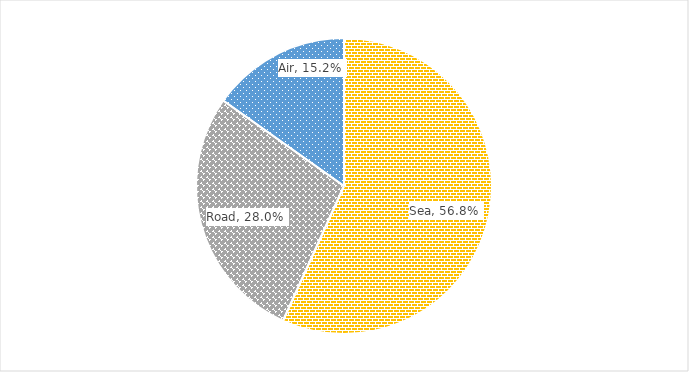
| Category | %Share |
|---|---|
| Sea | 0.568 |
| Road | 0.28 |
| Air | 0.152 |